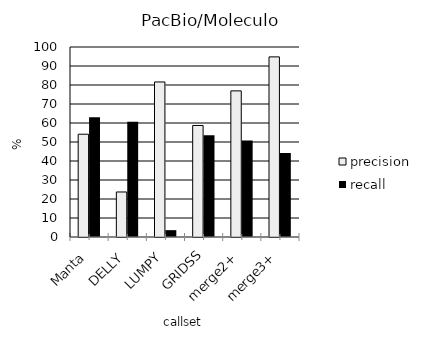
| Category | precision | recall |
|---|---|---|
| Manta | 54.1 | 63 |
| DELLY | 23.7 | 60.6 |
| LUMPY | 81.6 | 3.6 |
| GRIDSS | 58.7 | 53.5 |
| merge2+ | 76.9 | 50.8 |
| merge3+ | 94.8 | 44.2 |